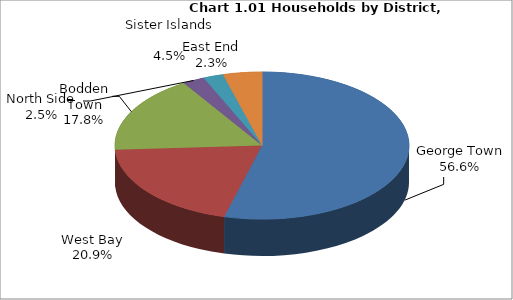
| Category | Series 0 |
|---|---|
| George Town | 14494 |
| West Bay | 5348 |
| Bodden Town | 4552 |
| North Side | 647 |
| East End | 593 |
| Sister Islands  | 1146 |